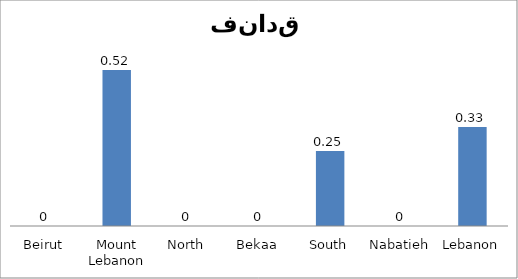
| Category | 11 |
|---|---|
| Beirut | 0 |
| Mount Lebanon | 0.52 |
| North | 0 |
| Bekaa | 0 |
| South | 0.25 |
| Nabatieh | 0 |
| Lebanon | 0.33 |